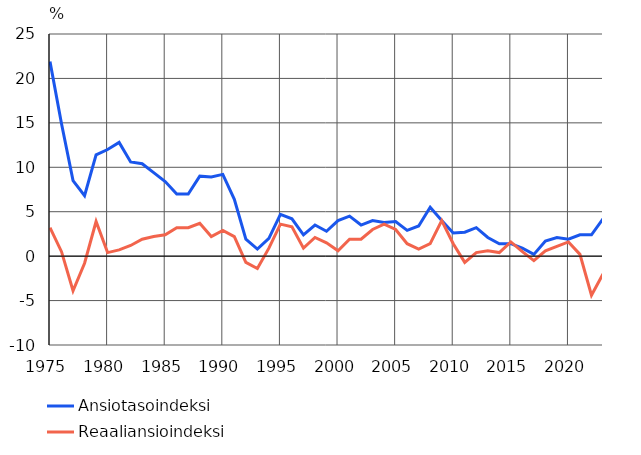
| Category | Ansiotasoindeksi | Reaaliansioindeksi |
|---|---|---|
| 1975 | 21.9 | 3.2 |
| 1976 | 14.9 | 0.5 |
| 1977 | 8.5 | -3.9 |
| 1978 | 6.8 | -0.8 |
| 1979 | 11.4 | 3.9 |
| 1980 | 12 | 0.4 |
| 1981 | 12.8 | 0.7 |
| 1982 | 10.6 | 1.2 |
| 1983 | 10.4 | 1.9 |
| 1984 | 9.4 | 2.2 |
| 1985 | 8.4 | 2.4 |
| 1986 | 7 | 3.2 |
| 1987 | 7 | 3.2 |
| 1988 | 9 | 3.7 |
| 1989 | 8.9 | 2.2 |
| 1990 | 9.2 | 2.9 |
| 1991 | 6.4 | 2.2 |
| 1992 | 1.9 | -0.7 |
| 1993 | 0.8 | -1.4 |
| 1994 | 2 | 0.9 |
| 1995 | 4.7 | 3.6 |
| 1996 | 4.2 | 3.3 |
| 1997 | 2.4 | 0.9 |
| 1998 | 3.5 | 2.1 |
| 1999 | 2.8 | 1.5 |
| 2000 | 4 | 0.6 |
| 2001 | 4.5 | 1.9 |
| 2002 | 3.5 | 1.9 |
| 2003 | 4 | 3 |
| 2004 | 3.8 | 3.6 |
| 2005 | 3.9 | 3 |
| 2006 | 2.9 | 1.4 |
| 2007 | 3.4 | 0.8 |
| 2008 | 5.5 | 1.4 |
| 2009 | 4 | 4 |
| 2010 | 2.6 | 1.4 |
| 2011 | 2.7 | -0.7 |
| 2012 | 3.2 | 0.4 |
| 2013 | 2.1 | 0.6 |
| 2014 | 1.4 | 0.4 |
| 2015 | 1.4 | 1.6 |
| 2016 | 0.9 | 0.5 |
| 2017 | 0.2 | -0.5 |
| 2018 | 1.7 | 0.6 |
| 2019 | 2.1 | 1.1 |
| 2020 | 1.9 | 1.6 |
| 2021 | 2.4 | 0.2 |
| 2022 | 2.4 | -4.4 |
| 2023* | 4.2 | -2 |